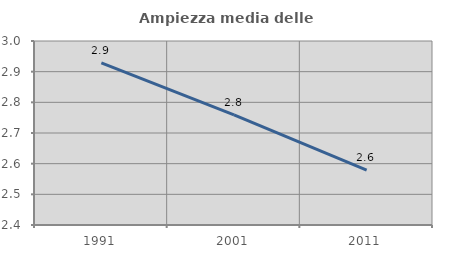
| Category | Ampiezza media delle famiglie |
|---|---|
| 1991.0 | 2.929 |
| 2001.0 | 2.759 |
| 2011.0 | 2.579 |